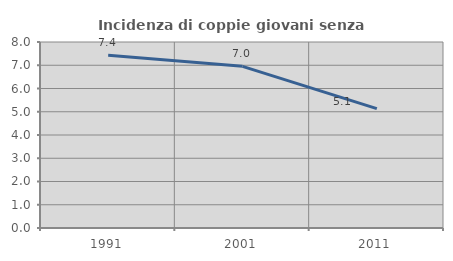
| Category | Incidenza di coppie giovani senza figli |
|---|---|
| 1991.0 | 7.432 |
| 2001.0 | 6.954 |
| 2011.0 | 5.134 |